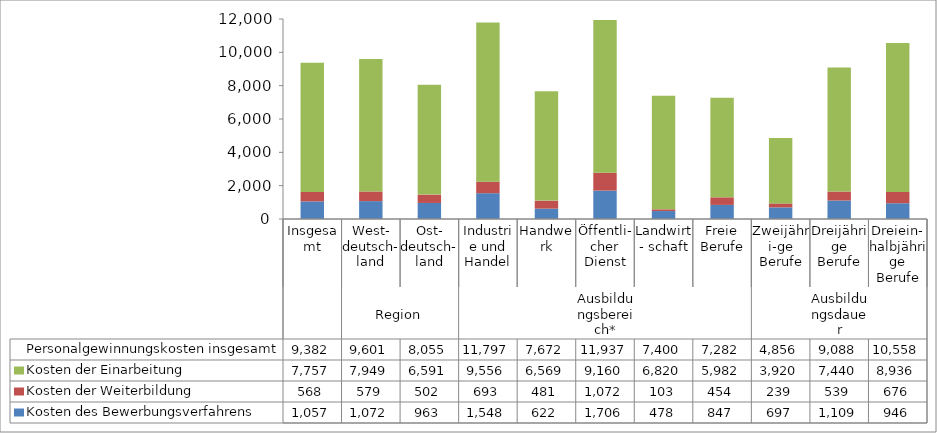
| Category | Kosten des Bewerbungsverfahrens | Kosten der Weiterbildung | Kosten der Einarbeitung | Personalgewinnungskosten insgesamt |
|---|---|---|---|---|
| 0 | 1056.718 | 568.45 | 7756.782 | 9381.951 |
| 1 | 1072.251 | 579.456 | 7949.109 | 9600.816 |
| 2 | 962.532 | 501.714 | 6590.571 | 8054.817 |
| 3 | 1547.993 | 692.936 | 9556.488 | 11797.42 |
| 4 | 621.995 | 481.14 | 6568.996 | 7672.132 |
| 5 | 1705.677 | 1071.684 | 9159.84 | 11937.2 |
| 6 | 477.85 | 102.747 | 6819.705 | 7400.303 |
| 7 | 846.751 | 453.614 | 5981.649 | 7282.014 |
| 8 | 696.858 | 239.387 | 3919.82 | 4856.066 |
| 9 | 1109.024 | 538.85 | 7439.972 | 9087.846 |
| 10 | 945.895 | 676.179 | 8936.419 | 10558.49 |